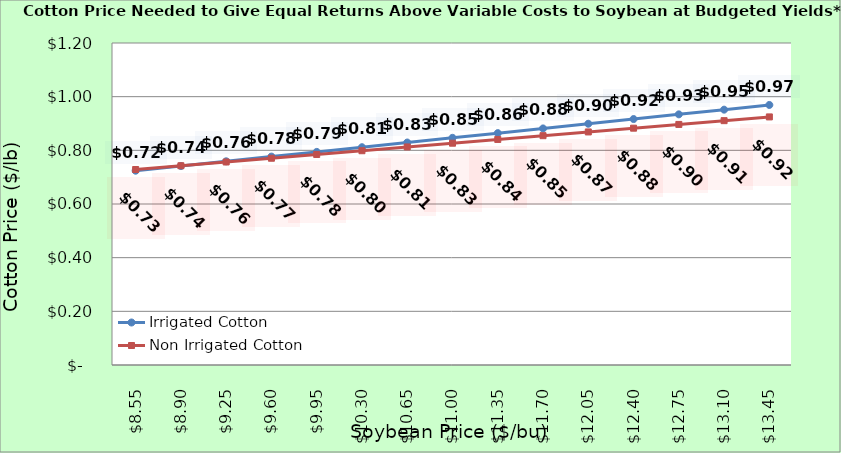
| Category | Irrigated Cotton | Non Irrigated Cotton |
|---|---|---|
| 8.550000000000002 | 0.724 | 0.729 |
| 8.900000000000002 | 0.742 | 0.743 |
| 9.250000000000002 | 0.759 | 0.757 |
| 9.600000000000001 | 0.777 | 0.771 |
| 9.950000000000001 | 0.794 | 0.785 |
| 10.3 | 0.812 | 0.799 |
| 10.65 | 0.829 | 0.813 |
| 11.0 | 0.847 | 0.827 |
| 11.35 | 0.864 | 0.841 |
| 11.7 | 0.882 | 0.855 |
| 12.049999999999999 | 0.899 | 0.869 |
| 12.399999999999999 | 0.917 | 0.883 |
| 12.749999999999998 | 0.934 | 0.897 |
| 13.099999999999998 | 0.952 | 0.911 |
| 13.449999999999998 | 0.969 | 0.925 |